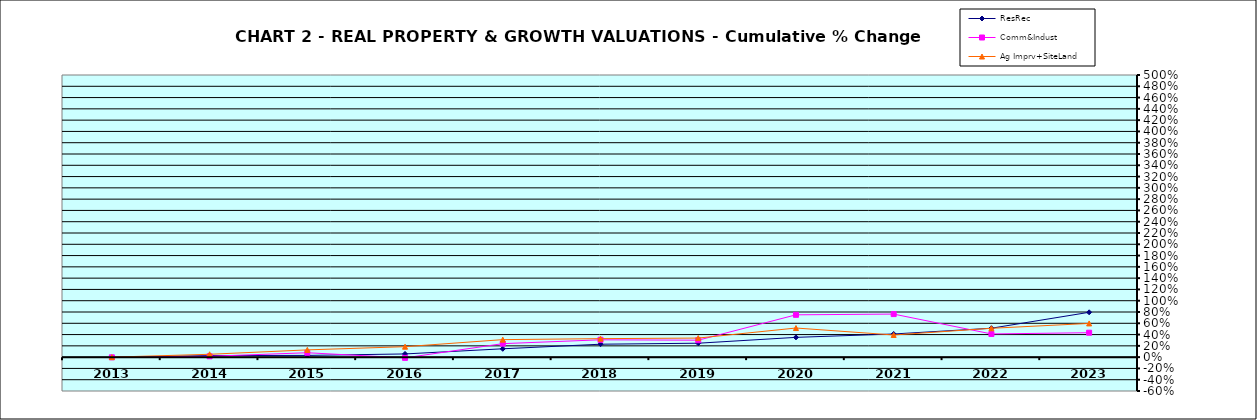
| Category | ResRec | Comm&Indust | Ag Imprv+SiteLand |
|---|---|---|---|
| 2013.0 | -0.007 | -0.003 | 0 |
| 2014.0 | 0.028 | 0.015 | 0.051 |
| 2015.0 | 0.031 | 0.078 | 0.129 |
| 2016.0 | 0.057 | -0.013 | 0.185 |
| 2017.0 | 0.148 | 0.239 | 0.31 |
| 2018.0 | 0.229 | 0.307 | 0.328 |
| 2019.0 | 0.247 | 0.3 | 0.338 |
| 2020.0 | 0.35 | 0.75 | 0.516 |
| 2021.0 | 0.411 | 0.763 | 0.392 |
| 2022.0 | 0.512 | 0.411 | 0.511 |
| 2023.0 | 0.795 | 0.433 | 0.597 |